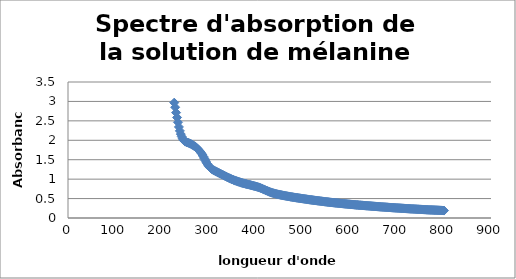
| Category | Series 0 |
|---|---|
| 800.0 | 0.192 |
| 798.0 | 0.193 |
| 796.0 | 0.194 |
| 794.0 | 0.195 |
| 792.0 | 0.196 |
| 790.0 | 0.198 |
| 788.0 | 0.199 |
| 786.0 | 0.2 |
| 784.0 | 0.201 |
| 782.0 | 0.202 |
| 780.0 | 0.203 |
| 778.0 | 0.204 |
| 776.0 | 0.205 |
| 774.0 | 0.207 |
| 772.0 | 0.208 |
| 770.0 | 0.209 |
| 768.0 | 0.21 |
| 766.0 | 0.212 |
| 764.0 | 0.212 |
| 762.0 | 0.214 |
| 760.0 | 0.215 |
| 758.0 | 0.216 |
| 756.0 | 0.217 |
| 754.0 | 0.219 |
| 752.0 | 0.22 |
| 750.0 | 0.222 |
| 748.0 | 0.223 |
| 746.0 | 0.224 |
| 744.0 | 0.225 |
| 742.0 | 0.227 |
| 740.0 | 0.228 |
| 738.0 | 0.23 |
| 736.0 | 0.231 |
| 734.0 | 0.233 |
| 732.0 | 0.234 |
| 730.0 | 0.235 |
| 728.0 | 0.236 |
| 726.0 | 0.238 |
| 724.0 | 0.239 |
| 722.0 | 0.241 |
| 720.0 | 0.242 |
| 718.0 | 0.244 |
| 716.0 | 0.246 |
| 714.0 | 0.248 |
| 712.0 | 0.248 |
| 710.0 | 0.25 |
| 708.0 | 0.252 |
| 706.0 | 0.253 |
| 704.0 | 0.255 |
| 702.0 | 0.256 |
| 700.0 | 0.258 |
| 698.0 | 0.259 |
| 696.0 | 0.261 |
| 694.0 | 0.263 |
| 692.0 | 0.264 |
| 690.0 | 0.266 |
| 688.0 | 0.268 |
| 686.0 | 0.27 |
| 684.0 | 0.271 |
| 682.0 | 0.273 |
| 680.0 | 0.275 |
| 678.0 | 0.277 |
| 676.0 | 0.278 |
| 674.0 | 0.28 |
| 672.0 | 0.282 |
| 670.0 | 0.283 |
| 668.0 | 0.285 |
| 666.0 | 0.287 |
| 664.0 | 0.288 |
| 662.0 | 0.29 |
| 660.0 | 0.292 |
| 658.0 | 0.294 |
| 656.0 | 0.296 |
| 654.0 | 0.298 |
| 652.0 | 0.3 |
| 650.0 | 0.302 |
| 648.0 | 0.304 |
| 646.0 | 0.305 |
| 644.0 | 0.308 |
| 642.0 | 0.309 |
| 640.0 | 0.312 |
| 638.0 | 0.314 |
| 636.0 | 0.315 |
| 634.0 | 0.317 |
| 632.0 | 0.319 |
| 630.0 | 0.321 |
| 628.0 | 0.323 |
| 626.0 | 0.325 |
| 624.0 | 0.327 |
| 622.0 | 0.329 |
| 620.0 | 0.33 |
| 618.0 | 0.333 |
| 616.0 | 0.335 |
| 614.0 | 0.336 |
| 612.0 | 0.338 |
| 610.0 | 0.341 |
| 608.0 | 0.344 |
| 606.0 | 0.345 |
| 604.0 | 0.348 |
| 602.0 | 0.349 |
| 600.0 | 0.352 |
| 598.0 | 0.354 |
| 596.0 | 0.356 |
| 594.0 | 0.359 |
| 592.0 | 0.361 |
| 590.0 | 0.363 |
| 588.0 | 0.366 |
| 586.0 | 0.369 |
| 584.0 | 0.371 |
| 582.0 | 0.373 |
| 580.0 | 0.375 |
| 578.0 | 0.378 |
| 576.0 | 0.38 |
| 574.0 | 0.383 |
| 572.0 | 0.386 |
| 570.0 | 0.388 |
| 568.0 | 0.391 |
| 566.0 | 0.393 |
| 564.0 | 0.396 |
| 562.0 | 0.398 |
| 560.0 | 0.401 |
| 558.0 | 0.404 |
| 556.0 | 0.406 |
| 554.0 | 0.409 |
| 552.0 | 0.412 |
| 550.0 | 0.415 |
| 548.0 | 0.418 |
| 546.0 | 0.421 |
| 544.0 | 0.424 |
| 542.0 | 0.428 |
| 540.0 | 0.43 |
| 538.0 | 0.433 |
| 536.0 | 0.437 |
| 534.0 | 0.44 |
| 532.0 | 0.443 |
| 530.0 | 0.446 |
| 528.0 | 0.449 |
| 526.0 | 0.452 |
| 524.0 | 0.455 |
| 522.0 | 0.458 |
| 520.0 | 0.462 |
| 518.0 | 0.465 |
| 516.0 | 0.468 |
| 514.0 | 0.471 |
| 512.0 | 0.475 |
| 510.0 | 0.479 |
| 508.0 | 0.482 |
| 506.0 | 0.486 |
| 504.0 | 0.49 |
| 502.0 | 0.493 |
| 500.0 | 0.496 |
| 498.0 | 0.5 |
| 496.0 | 0.503 |
| 494.0 | 0.507 |
| 492.0 | 0.511 |
| 490.0 | 0.514 |
| 488.0 | 0.518 |
| 486.0 | 0.521 |
| 484.0 | 0.525 |
| 482.0 | 0.529 |
| 480.0 | 0.533 |
| 478.0 | 0.537 |
| 476.0 | 0.541 |
| 474.0 | 0.546 |
| 472.0 | 0.55 |
| 470.0 | 0.554 |
| 468.0 | 0.558 |
| 466.0 | 0.562 |
| 464.0 | 0.567 |
| 462.0 | 0.572 |
| 460.0 | 0.576 |
| 458.0 | 0.581 |
| 456.0 | 0.585 |
| 454.0 | 0.59 |
| 452.0 | 0.594 |
| 450.0 | 0.599 |
| 448.0 | 0.606 |
| 446.0 | 0.611 |
| 444.0 | 0.617 |
| 442.0 | 0.623 |
| 440.0 | 0.629 |
| 438.0 | 0.636 |
| 436.0 | 0.643 |
| 434.0 | 0.65 |
| 432.0 | 0.659 |
| 430.0 | 0.666 |
| 428.0 | 0.676 |
| 426.0 | 0.686 |
| 424.0 | 0.696 |
| 422.0 | 0.706 |
| 420.0 | 0.717 |
| 418.0 | 0.728 |
| 416.0 | 0.739 |
| 414.0 | 0.75 |
| 412.0 | 0.761 |
| 410.0 | 0.771 |
| 408.0 | 0.78 |
| 406.0 | 0.789 |
| 404.0 | 0.796 |
| 402.0 | 0.804 |
| 400.0 | 0.811 |
| 398.0 | 0.817 |
| 396.0 | 0.823 |
| 394.0 | 0.829 |
| 392.0 | 0.836 |
| 390.0 | 0.842 |
| 388.0 | 0.848 |
| 386.0 | 0.855 |
| 384.0 | 0.861 |
| 382.0 | 0.867 |
| 380.0 | 0.873 |
| 378.0 | 0.878 |
| 376.0 | 0.885 |
| 374.0 | 0.892 |
| 372.0 | 0.897 |
| 370.0 | 0.904 |
| 368.0 | 0.911 |
| 366.0 | 0.92 |
| 364.0 | 0.93 |
| 362.0 | 0.935 |
| 360.0 | 0.944 |
| 358.0 | 0.953 |
| 356.0 | 0.961 |
| 354.0 | 0.97 |
| 352.0 | 0.979 |
| 350.0 | 0.99 |
| 348.0 | 1.001 |
| 346.0 | 1.011 |
| 344.0 | 1.023 |
| 342.0 | 1.033 |
| 340.0 | 1.043 |
| 338.0 | 1.058 |
| 336.0 | 1.069 |
| 334.0 | 1.08 |
| 332.0 | 1.093 |
| 330.0 | 1.105 |
| 328.0 | 1.118 |
| 326.0 | 1.128 |
| 324.0 | 1.141 |
| 322.0 | 1.154 |
| 320.0 | 1.166 |
| 318.0 | 1.178 |
| 316.0 | 1.191 |
| 314.0 | 1.203 |
| 312.0 | 1.217 |
| 310.0 | 1.229 |
| 308.0 | 1.243 |
| 306.0 | 1.259 |
| 304.0 | 1.279 |
| 302.0 | 1.303 |
| 300.0 | 1.33 |
| 298.0 | 1.364 |
| 296.0 | 1.399 |
| 294.0 | 1.442 |
| 292.0 | 1.486 |
| 290.0 | 1.535 |
| 288.0 | 1.58 |
| 286.0 | 1.624 |
| 284.0 | 1.665 |
| 282.0 | 1.697 |
| 280.0 | 1.725 |
| 278.0 | 1.75 |
| 276.0 | 1.777 |
| 274.0 | 1.802 |
| 272.0 | 1.822 |
| 270.0 | 1.842 |
| 268.0 | 1.857 |
| 266.0 | 1.873 |
| 264.0 | 1.887 |
| 262.0 | 1.901 |
| 260.0 | 1.914 |
| 258.0 | 1.924 |
| 256.0 | 1.934 |
| 254.0 | 1.943 |
| 252.0 | 1.952 |
| 250.0 | 1.965 |
| 248.0 | 1.98 |
| 246.0 | 2.003 |
| 244.0 | 2.04 |
| 242.0 | 2.095 |
| 240.0 | 2.159 |
| 238.0 | 2.242 |
| 236.0 | 2.343 |
| 234.0 | 2.464 |
| 232.0 | 2.587 |
| 230.0 | 2.712 |
| 228.0 | 2.85 |
| 226.0 | 2.968 |